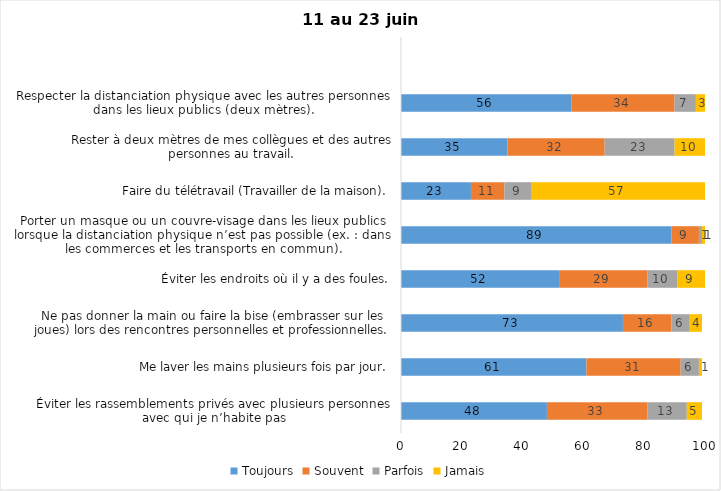
| Category | Toujours | Souvent | Parfois | Jamais |
|---|---|---|---|---|
| Éviter les rassemblements privés avec plusieurs personnes avec qui je n’habite pas | 48 | 33 | 13 | 5 |
| Me laver les mains plusieurs fois par jour. | 61 | 31 | 6 | 1 |
| Ne pas donner la main ou faire la bise (embrasser sur les joues) lors des rencontres personnelles et professionnelles. | 73 | 16 | 6 | 4 |
| Éviter les endroits où il y a des foules. | 52 | 29 | 10 | 9 |
| Porter un masque ou un couvre-visage dans les lieux publics lorsque la distanciation physique n’est pas possible (ex. : dans les commerces et les transports en commun). | 89 | 9 | 1 | 1 |
| Faire du télétravail (Travailler de la maison). | 23 | 11 | 9 | 57 |
| Rester à deux mètres de mes collègues et des autres personnes au travail. | 35 | 32 | 23 | 10 |
| Respecter la distanciation physique avec les autres personnes dans les lieux publics (deux mètres). | 56 | 34 | 7 | 3 |